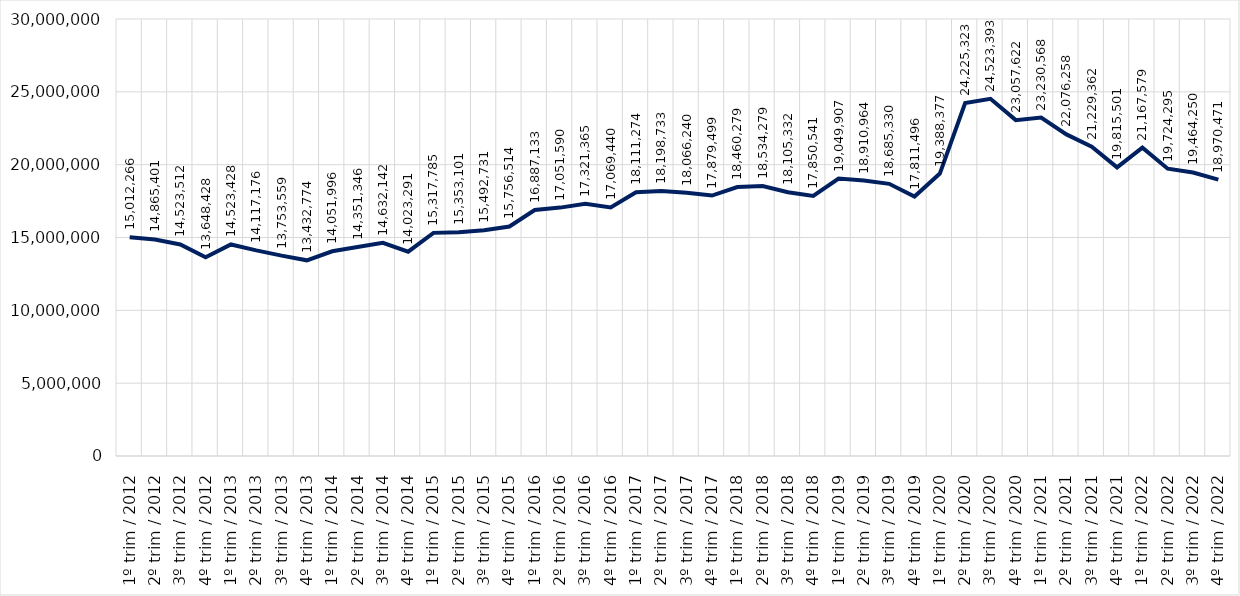
| Category | Conjunto das RMs |
|---|---|
| 1º trim / 2012 | 15012266 |
| 2º trim / 2012 | 14865401 |
| 3º trim / 2012 | 14523512 |
| 4º trim / 2012 | 13648428 |
| 1º trim / 2013 | 14523428 |
| 2º trim / 2013 | 14117176 |
| 3º trim / 2013 | 13753559 |
| 4º trim / 2013 | 13432774 |
| 1º trim / 2014 | 14051996 |
| 2º trim / 2014 | 14351346 |
| 3º trim / 2014 | 14632142 |
| 4º trim / 2014 | 14023291 |
| 1º trim / 2015 | 15317785 |
| 2º trim / 2015 | 15353101 |
| 3º trim / 2015 | 15492731 |
| 4º trim / 2015 | 15756514 |
| 1º trim / 2016 | 16887133 |
| 2º trim / 2016 | 17051590 |
| 3º trim / 2016 | 17321365 |
| 4º trim / 2016 | 17069440 |
| 1º trim / 2017 | 18111274 |
| 2º trim / 2017 | 18198733 |
| 3º trim / 2017 | 18066240 |
| 4º trim / 2017 | 17879499 |
| 1º trim / 2018 | 18460279 |
| 2º trim / 2018 | 18534279 |
| 3º trim / 2018 | 18105332 |
| 4º trim / 2018 | 17850541 |
| 1º trim / 2019 | 19049907 |
| 2º trim / 2019 | 18910964 |
| 3º trim / 2019 | 18685330 |
| 4º trim / 2019 | 17811496 |
| 1º trim / 2020 | 19388377 |
| 2º trim / 2020 | 24225323 |
| 3º trim / 2020 | 24523393 |
| 4º trim / 2020 | 23057622 |
| 1º trim / 2021 | 23230568 |
| 2º trim / 2021 | 22076258 |
| 3º trim / 2021 | 21229362 |
| 4º trim / 2021 | 19815501 |
| 1º trim / 2022 | 21167579 |
| 2º trim / 2022 | 19724295 |
| 3º trim / 2022 | 19464250 |
| 4º trim / 2022 | 18970471 |